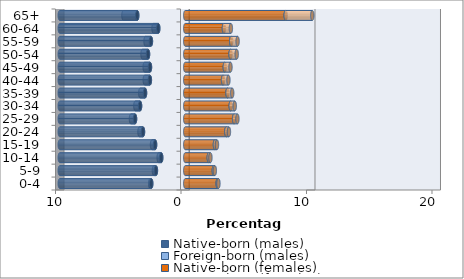
| Category | Native-born (males) | Foreign-born (males) | Native-born (females) | Foreign-born (females) |
|---|---|---|---|---|
| 0-4 | -2.711 | -0.086 | 2.582 | 0.061 |
| 5-9 | -2.337 | -0.16 | 2.275 | 0.082 |
| 10-14 | -1.915 | -0.204 | 1.875 | 0.131 |
| 15-19 | -2.403 | -0.245 | 2.364 | 0.162 |
| 20-24 | -3.368 | -0.28 | 3.27 | 0.209 |
| 25-29 | -4 | -0.327 | 3.892 | 0.264 |
| 30-34 | -3.601 | -0.374 | 3.624 | 0.319 |
| 35-39 | -3.205 | -0.381 | 3.367 | 0.374 |
| 40-44 | -2.819 | -0.406 | 3.012 | 0.428 |
| 45-49 | -2.811 | -0.422 | 3.151 | 0.451 |
| 50-54 | -2.965 | -0.439 | 3.61 | 0.489 |
| 55-59 | -2.735 | -0.429 | 3.659 | 0.511 |
| 60-64 | -2.152 | -0.378 | 3.08 | 0.555 |
| 65+ | -3.827 | -1.099 | 8.002 | 2.119 |